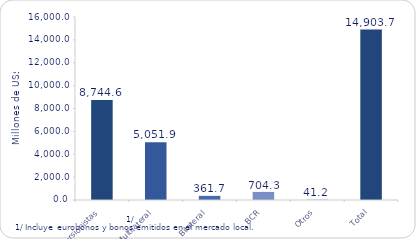
| Category | Series 1 |
|---|---|
| Inversionistas | 8744.6 |
| Multilateral | 5051.9 |
| Bilateral | 361.7 |
| BCR | 704.3 |
| Otros | 41.2 |
| Total | 14903.7 |